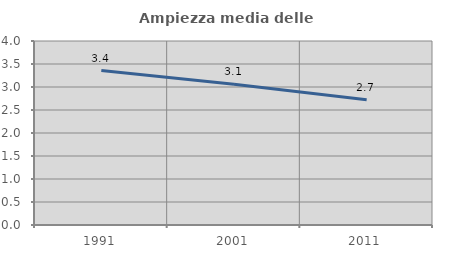
| Category | Ampiezza media delle famiglie |
|---|---|
| 1991.0 | 3.358 |
| 2001.0 | 3.06 |
| 2011.0 | 2.725 |